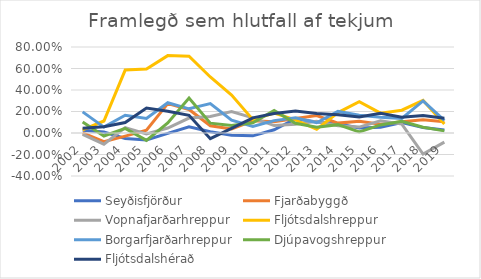
| Category | Seyðisfjörður | Fjarðabyggð | Vopnafjarðarhreppur | Fljótsdalshreppur | Borgarfjarðarhreppur | Djúpavogshreppur | Fljótsdalshérað |
|---|---|---|---|---|---|---|---|
| 2002.0 | 0.026 | 0.002 | -0.013 | 0.029 | 0.197 | 0.103 | 0.044 |
| 2003.0 | 0.009 | -0.081 | -0.104 | 0.112 | 0.055 | -0.028 | 0.058 |
| 2004.0 | -0.051 | -0.029 | 0.05 | 0.586 | 0.165 | 0.043 | 0.097 |
| 2005.0 | -0.065 | 0.026 | -0.008 | 0.596 | 0.135 | -0.068 | 0.231 |
| 2006.0 | -0.004 | 0.273 | 0.046 | 0.72 | 0.282 | 0.093 | 0.202 |
| 2007.0 | 0.057 | 0.219 | 0.139 | 0.714 | 0.225 | 0.325 | 0.164 |
| 2008.0 | 0.012 | 0.067 | 0.154 | 0.521 | 0.273 | 0.091 | -0.053 |
| 2009.0 | -0.021 | 0.037 | 0.2 | 0.353 | 0.12 | 0.069 | 0.043 |
| 2010.0 | -0.027 | 0.114 | 0.141 | 0.124 | 0.06 | 0.096 | 0.141 |
| 2011.0 | 0.03 | 0.105 | 0.069 | 0.185 | 0.115 | 0.21 | 0.181 |
| 2012.0 | 0.133 | 0.135 | 0.082 | 0.121 | 0.142 | 0.091 | 0.204 |
| 2013.0 | 0.102 | 0.162 | 0.108 | 0.034 | 0.096 | 0.054 | 0.181 |
| 2014.0 | 0.087 | 0.092 | 0.068 | 0.19 | 0.201 | 0.078 | 0.17 |
| 2015.0 | 0.046 | 0.108 | 0.055 | 0.292 | 0.165 | 0.01 | 0.15 |
| 2016.0 | 0.053 | 0.081 | 0.113 | 0.184 | 0.147 | 0.075 | 0.183 |
| 2017.0 | 0.098 | 0.104 | 0.082 | 0.212 | 0.136 | 0.11 | 0.146 |
| 2018.0 | 0.05 | 0.124 | -0.197 | 0.303 | 0.298 | 0.054 | 0.163 |
| 2019.0 | 0.029 | 0.105 | -0.085 | 0.083 | 0.117 | 0.02 | 0.138 |